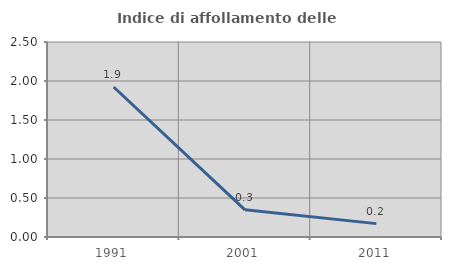
| Category | Indice di affollamento delle abitazioni  |
|---|---|
| 1991.0 | 1.923 |
| 2001.0 | 0.348 |
| 2011.0 | 0.172 |